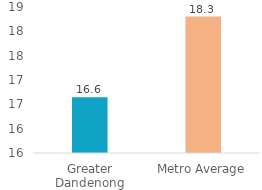
| Category | Series 0 |
|---|---|
| Greater Dandenong | 16.646 |
| Metro Average | 18.303 |